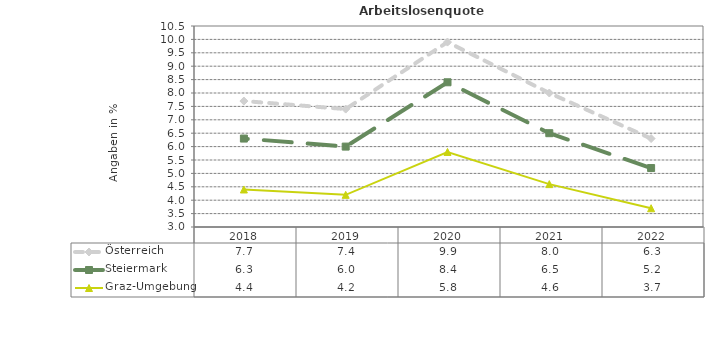
| Category | Österreich | Steiermark | Graz-Umgebung |
|---|---|---|---|
| 2022.0 | 6.3 | 5.2 | 3.7 |
| 2021.0 | 8 | 6.5 | 4.6 |
| 2020.0 | 9.9 | 8.4 | 5.8 |
| 2019.0 | 7.4 | 6 | 4.2 |
| 2018.0 | 7.7 | 6.3 | 4.4 |